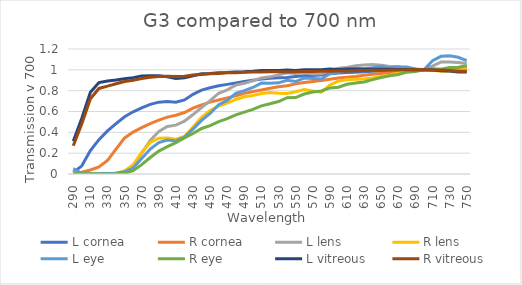
| Category | L cornea | R cornea | L lens | R lens | L eye | R eye | L vitreous | R vitreous |
|---|---|---|---|---|---|---|---|---|
| 290.0 | 0.015 | 0.009 | 0.02 | 0.012 | 0.053 | 0.013 | 0.315 | 0.272 |
| 300.0 | 0.078 | 0.017 | 0.002 | 0.001 | 0.005 | 0.001 | 0.535 | 0.482 |
| 310.0 | 0.225 | 0.039 | 0.001 | 0.001 | 0.003 | 0.001 | 0.785 | 0.723 |
| 320.0 | 0.33 | 0.067 | 0.001 | 0.002 | 0.003 | 0.001 | 0.878 | 0.821 |
| 330.0 | 0.414 | 0.129 | 0.003 | 0.003 | 0.005 | 0 | 0.892 | 0.844 |
| 340.0 | 0.484 | 0.24 | 0.006 | 0.008 | 0.008 | 0.002 | 0.902 | 0.866 |
| 350.0 | 0.549 | 0.346 | 0.023 | 0.028 | 0.021 | 0.008 | 0.914 | 0.887 |
| 360.0 | 0.597 | 0.402 | 0.072 | 0.089 | 0.057 | 0.031 | 0.925 | 0.901 |
| 370.0 | 0.635 | 0.445 | 0.2 | 0.206 | 0.148 | 0.09 | 0.942 | 0.917 |
| 380.0 | 0.668 | 0.484 | 0.323 | 0.303 | 0.24 | 0.159 | 0.944 | 0.929 |
| 390.0 | 0.69 | 0.517 | 0.408 | 0.344 | 0.302 | 0.219 | 0.944 | 0.936 |
| 400.0 | 0.696 | 0.546 | 0.457 | 0.345 | 0.326 | 0.263 | 0.933 | 0.938 |
| 410.0 | 0.689 | 0.565 | 0.469 | 0.334 | 0.318 | 0.301 | 0.916 | 0.936 |
| 420.0 | 0.711 | 0.59 | 0.507 | 0.361 | 0.355 | 0.345 | 0.924 | 0.939 |
| 430.0 | 0.765 | 0.632 | 0.571 | 0.452 | 0.431 | 0.388 | 0.943 | 0.951 |
| 440.0 | 0.805 | 0.664 | 0.638 | 0.543 | 0.515 | 0.437 | 0.962 | 0.956 |
| 450.0 | 0.828 | 0.69 | 0.704 | 0.61 | 0.583 | 0.464 | 0.964 | 0.962 |
| 460.0 | 0.846 | 0.711 | 0.775 | 0.651 | 0.665 | 0.503 | 0.973 | 0.966 |
| 470.0 | 0.861 | 0.731 | 0.808 | 0.68 | 0.706 | 0.532 | 0.975 | 0.971 |
| 480.0 | 0.875 | 0.75 | 0.853 | 0.715 | 0.774 | 0.568 | 0.98 | 0.973 |
| 490.0 | 0.889 | 0.774 | 0.871 | 0.741 | 0.8 | 0.594 | 0.982 | 0.977 |
| 500.0 | 0.9 | 0.793 | 0.895 | 0.754 | 0.83 | 0.62 | 0.987 | 0.979 |
| 510.0 | 0.911 | 0.807 | 0.922 | 0.773 | 0.872 | 0.654 | 0.994 | 0.979 |
| 520.0 | 0.92 | 0.823 | 0.933 | 0.783 | 0.871 | 0.674 | 0.994 | 0.981 |
| 530.0 | 0.924 | 0.837 | 0.952 | 0.774 | 0.875 | 0.696 | 0.995 | 0.981 |
| 540.0 | 0.927 | 0.847 | 0.972 | 0.772 | 0.9 | 0.732 | 0.997 | 0.98 |
| 550.0 | 0.935 | 0.865 | 0.964 | 0.79 | 0.888 | 0.733 | 0.994 | 0.982 |
| 560.0 | 0.943 | 0.877 | 0.975 | 0.812 | 0.921 | 0.768 | 1.002 | 0.983 |
| 570.0 | 0.945 | 0.888 | 0.96 | 0.797 | 0.917 | 0.787 | 1.001 | 0.983 |
| 580.0 | 0.949 | 0.898 | 0.961 | 0.785 | 0.912 | 0.797 | 1 | 0.985 |
| 590.0 | 0.962 | 0.909 | 0.99 | 0.855 | 0.962 | 0.826 | 1.007 | 0.987 |
| 600.0 | 0.969 | 0.921 | 1.015 | 0.892 | 0.974 | 0.833 | 1.004 | 0.989 |
| 610.0 | 0.974 | 0.93 | 1.022 | 0.904 | 1.003 | 0.862 | 1.008 | 0.989 |
| 620.0 | 0.976 | 0.936 | 1.039 | 0.908 | 1.012 | 0.873 | 1.007 | 0.992 |
| 630.0 | 0.982 | 0.948 | 1.046 | 0.913 | 1.011 | 0.884 | 1.005 | 0.994 |
| 640.0 | 0.986 | 0.958 | 1.051 | 0.922 | 1.02 | 0.906 | 1.006 | 0.995 |
| 650.0 | 0.989 | 0.965 | 1.045 | 0.937 | 1.034 | 0.927 | 1.005 | 0.996 |
| 660.0 | 0.99 | 0.971 | 1.031 | 0.949 | 1.019 | 0.943 | 1.005 | 0.997 |
| 670.0 | 0.994 | 0.98 | 1.031 | 0.97 | 1.027 | 0.956 | 1.003 | 0.999 |
| 680.0 | 0.996 | 0.987 | 1.011 | 0.986 | 1.028 | 0.978 | 1.004 | 1 |
| 690.0 | 0.999 | 0.994 | 1.007 | 0.998 | 1.008 | 0.984 | 1 | 1.001 |
| 700.0 | 1 | 1 | 1 | 1 | 1 | 1 | 1 | 1 |
| 710.0 | 1.002 | 1.002 | 1.037 | 0.996 | 1.088 | 1.009 | 0.997 | 0.999 |
| 720.0 | 1.003 | 1.003 | 1.076 | 0.986 | 1.13 | 1.006 | 0.992 | 0.998 |
| 730.0 | 1.004 | 1.009 | 1.074 | 0.987 | 1.134 | 1.022 | 0.99 | 0.994 |
| 740.0 | 1.007 | 1.017 | 1.071 | 0.994 | 1.12 | 1.025 | 0.98 | 0.987 |
| 750.0 | 1.009 | 1.026 | 1.061 | 1.013 | 1.087 | 1.04 | 0.978 | 0.987 |